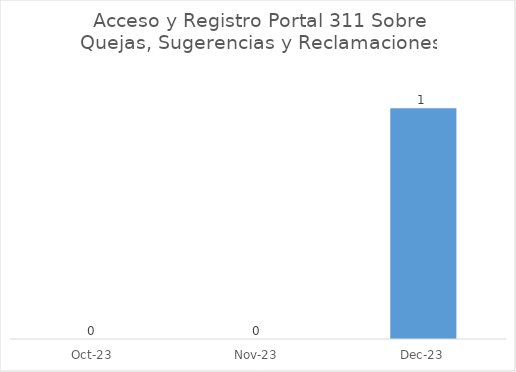
| Category | Cantidad |
|---|---|
| 2023-10-01 | 0 |
| 2023-11-01 | 0 |
| 2023-12-01 | 1 |